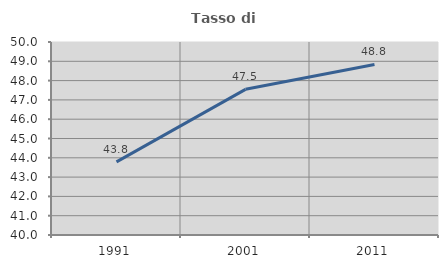
| Category | Tasso di occupazione   |
|---|---|
| 1991.0 | 43.788 |
| 2001.0 | 47.548 |
| 2011.0 | 48.836 |